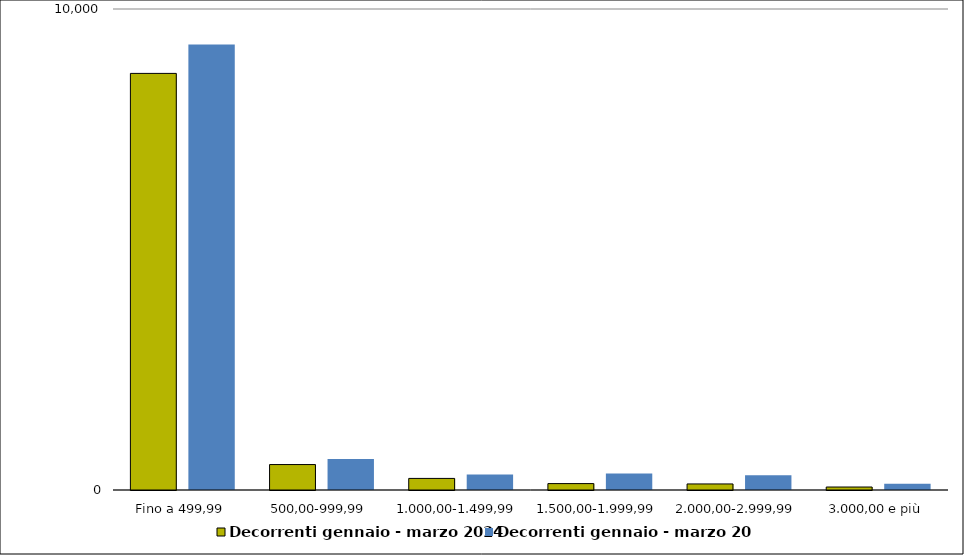
| Category | Decorrenti gennaio - marzo 2024 | Decorrenti gennaio - marzo 2023 |
|---|---|---|
|  Fino a 499,99  | 8661 | 9261 |
|  500,00-999,99  | 529 | 644 |
|  1.000,00-1.499,99  | 241 | 320 |
|  1.500,00-1.999,99  | 133 | 344 |
|  2.000,00-2.999,99  | 126 | 306 |
|  3.000,00 e più  | 62 | 131 |